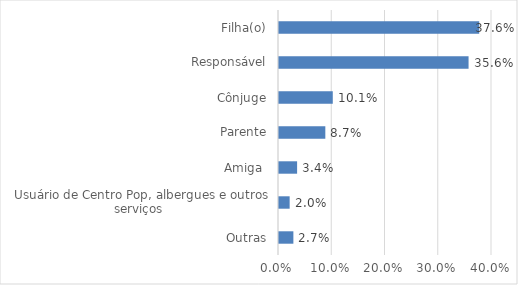
| Category | Series 0 |
|---|---|
| Outras | 0.027 |
| Usuário de Centro Pop, albergues e outros serviços  | 0.02 |
| Amiga  | 0.034 |
| Parente | 0.087 |
| Cônjuge | 0.101 |
| Responsável | 0.356 |
| Filha(o) | 0.376 |